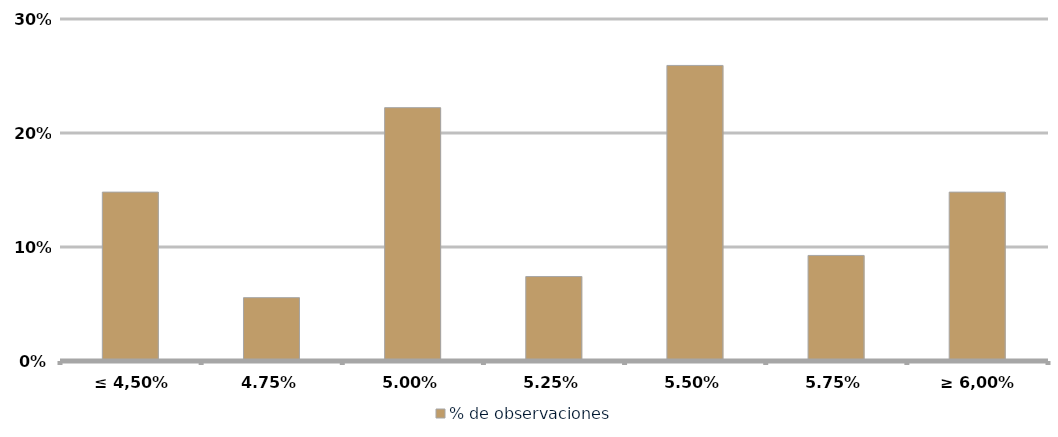
| Category | % de observaciones  |
|---|---|
| ≤ 4,50% | 0.148 |
| 4,75% | 0.056 |
| 5,00% | 0.222 |
| 5,25% | 0.074 |
| 5,50% | 0.259 |
| 5,75% | 0.093 |
| ≥ 6,00% | 0.148 |